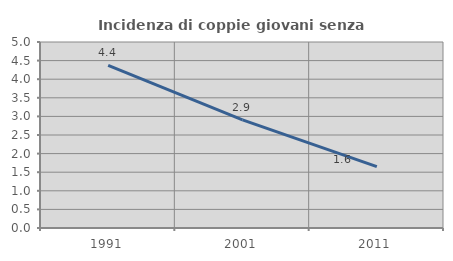
| Category | Incidenza di coppie giovani senza figli |
|---|---|
| 1991.0 | 4.372 |
| 2001.0 | 2.906 |
| 2011.0 | 1.648 |